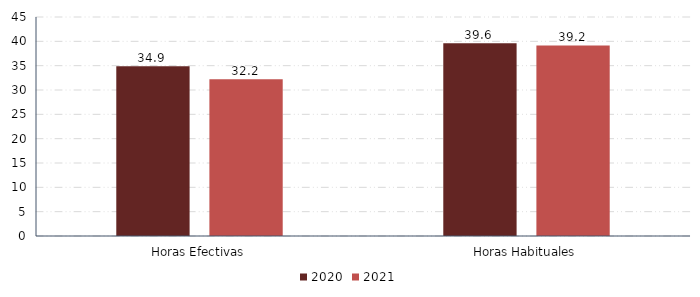
| Category | 2020 | 2021 |
|---|---|---|
| Horas Efectivas | 34.868 | 32.219 |
| Horas Habituales | 39.627 | 39.155 |